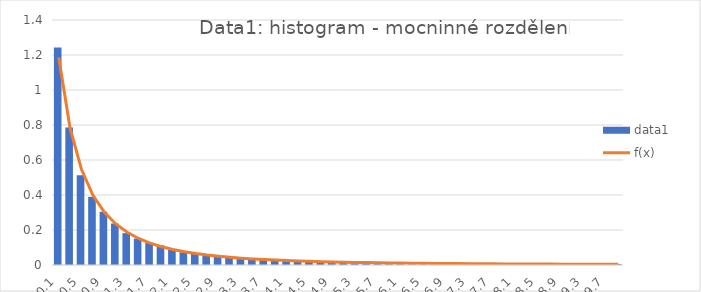
| Category | data1 |
|---|---|
| 0.1 | 1.242 |
| 0.30000000000000004 | 0.786 |
| 0.5 | 0.513 |
| 0.7000000000000001 | 0.39 |
| 0.9 | 0.304 |
| 1.1 | 0.237 |
| 1.2999999999999998 | 0.182 |
| 1.5 | 0.151 |
| 1.6999999999999997 | 0.128 |
| 1.9 | 0.112 |
| 2.0999999999999996 | 0.088 |
| 2.3 | 0.072 |
| 2.5 | 0.068 |
| 2.7 | 0.06 |
| 2.9000000000000004 | 0.051 |
| 3.1000000000000005 | 0.044 |
| 3.3000000000000007 | 0.04 |
| 3.500000000000001 | 0.028 |
| 3.700000000000001 | 0.036 |
| 3.9000000000000012 | 0.031 |
| 4.100000000000001 | 0.03 |
| 4.300000000000001 | 0.023 |
| 4.500000000000002 | 0.02 |
| 4.700000000000001 | 0.018 |
| 4.900000000000002 | 0.022 |
| 5.100000000000001 | 0.02 |
| 5.3000000000000025 | 0.011 |
| 5.500000000000002 | 0.016 |
| 5.700000000000003 | 0.012 |
| 5.900000000000002 | 0.016 |
| 6.100000000000003 | 0.009 |
| 6.3000000000000025 | 0.011 |
| 6.5000000000000036 | 0.007 |
| 6.700000000000003 | 0.01 |
| 6.900000000000004 | 0.008 |
| 7.100000000000003 | 0.01 |
| 7.300000000000004 | 0.008 |
| 7.5000000000000036 | 0.006 |
| 7.700000000000005 | 0.004 |
| 7.900000000000004 | 0.009 |
| 8.100000000000003 | 0.006 |
| 8.300000000000002 | 0.006 |
| 8.500000000000002 | 0.006 |
| 8.700000000000001 | 0.004 |
| 8.9 | 0.004 |
| 9.1 | 0.006 |
| 9.299999999999999 | 0.006 |
| 9.499999999999998 | 0.006 |
| 9.699999999999998 | 0.004 |
| 9.899999999999997 | 0.005 |